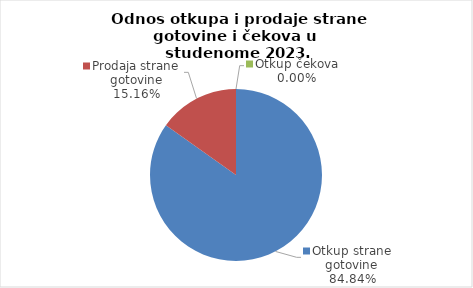
| Category | Series 0 |
|---|---|
| Otkup strane gotovine | 84.841 |
| Prodaja strane gotovine | 15.159 |
| Otkup čekova | 0 |